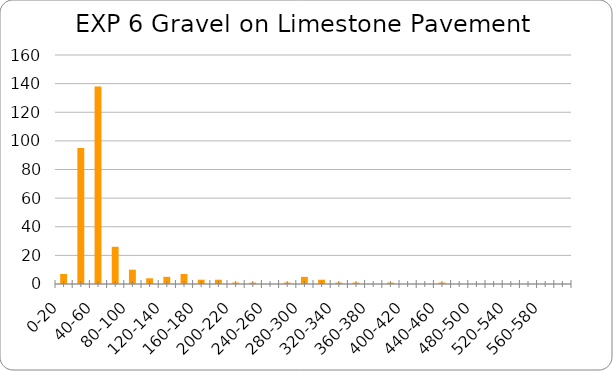
| Category | Series 0 |
|---|---|
| 0-20 | 7 |
| 20-40 | 95 |
| 40-60 | 138 |
| 60-80 | 26 |
| 80-100 | 10 |
| 100-120 | 4 |
| 120-140 | 5 |
| 140-160 | 7 |
| 160-180 | 3 |
| 180-200 | 3 |
| 200-220 | 1 |
| 220-240 | 1 |
| 240-260 | 0 |
| 260-280 | 1 |
| 280-300 | 5 |
| 300-320 | 3 |
| 320-340 | 1 |
| 340-360 | 1 |
| 360-380 | 0 |
| 380-400 | 1 |
| 400-420 | 0 |
| 420-440 | 0 |
| 440-460 | 1 |
| 460-480 | 0 |
| 480-500 | 0 |
| 500-520 | 0 |
| 520-540 | 0 |
| 540-560 | 0 |
| 560-580 | 0 |
| 580-600 | 0 |